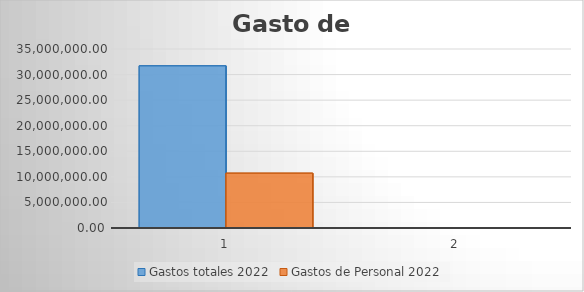
| Category | Gastos totales 2022 | Gastos de Personal 2022 |
|---|---|---|
| 0 | 31706867.73 | 10716459.58 |
| 1 | 1479.348 | 499.998 |